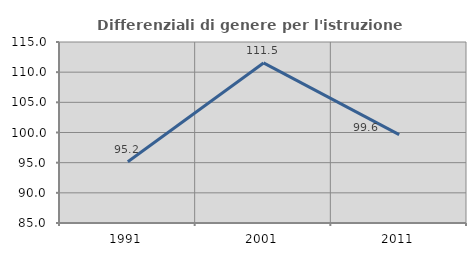
| Category | Differenziali di genere per l'istruzione superiore |
|---|---|
| 1991.0 | 95.164 |
| 2001.0 | 111.531 |
| 2011.0 | 99.643 |